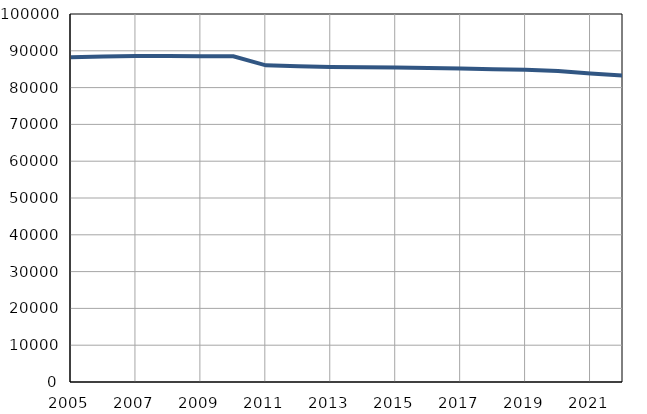
| Category | Број
становника |
|---|---|
| 2005.0 | 88271 |
| 2006.0 | 88439 |
| 2007.0 | 88602 |
| 2008.0 | 88608 |
| 2009.0 | 88532 |
| 2010.0 | 88504 |
| 2011.0 | 86046 |
| 2012.0 | 85771 |
| 2013.0 | 85607 |
| 2014.0 | 85555 |
| 2015.0 | 85463 |
| 2016.0 | 85340 |
| 2017.0 | 85180 |
| 2018.0 | 85012 |
| 2019.0 | 84880 |
| 2020.0 | 84520 |
| 2021.0 | 83808 |
| 2022.0 | 83275 |